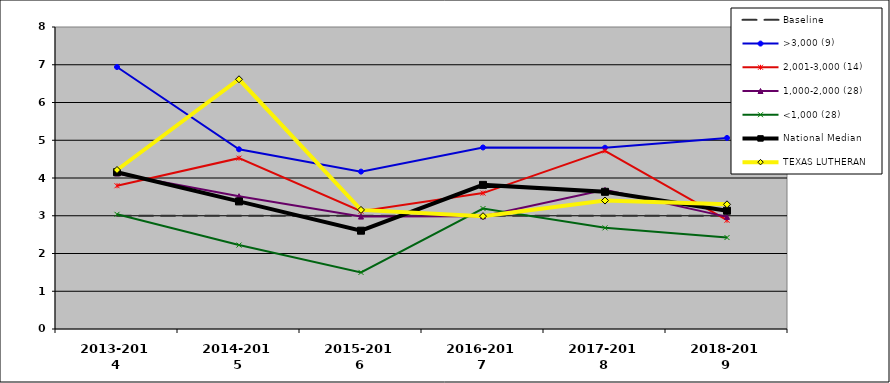
| Category | Baseline | >3,000 (9) | 2,001-3,000 (14) | 1,000-2,000 (28) | <1,000 (28) | National Median | TEXAS LUTHERAN |
|---|---|---|---|---|---|---|---|
| 2013-2014 | 3 | 6.94 | 3.795 | 4.12 | 3.038 | 4.153 | 4.212 |
| 2014-2015 | 3 | 4.76 | 4.526 | 3.519 | 2.223 | 3.379 | 6.615 |
| 2015-2016 | 3 | 4.169 | 3.12 | 2.978 | 1.499 | 2.604 | 3.155 |
| 2016-2017 | 3 | 4.809 | 3.6 | 2.986 | 3.191 | 3.818 | 2.989 |
| 2017-2018 | 3 | 4.801 | 4.719 | 3.687 | 2.679 | 3.634 | 3.403 |
| 2018-2019 | 3 | 5.061 | 2.881 | 2.97 | 2.423 | 3.133 | 3.303 |